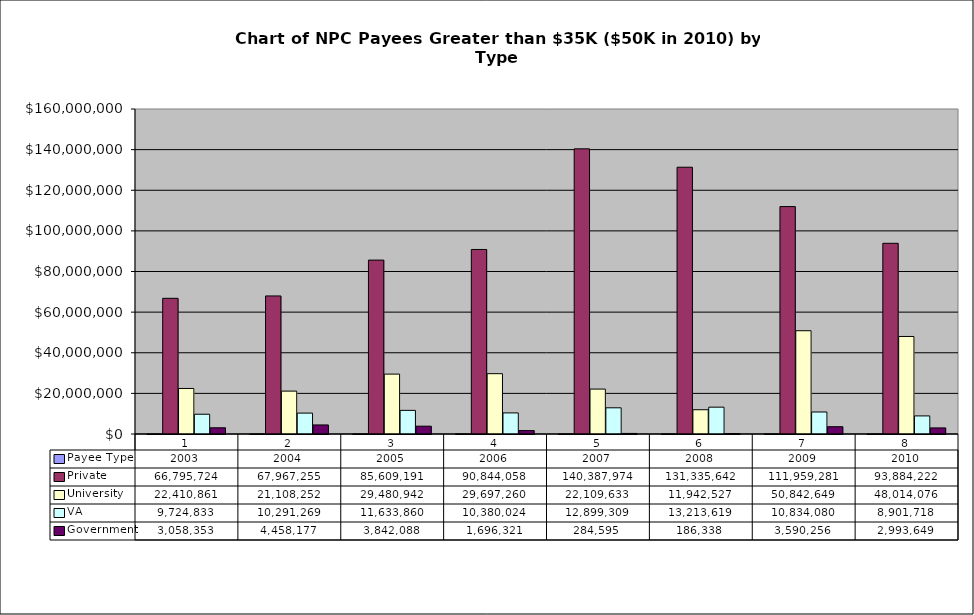
| Category | Payee Type | Private | University | VA | Government |
|---|---|---|---|---|---|
| 0 | 2003 | 66795724.18 | 22410860.58 | 9724832.94 | 3058352.9 |
| 1 | 2004 | 67967255 | 21108252 | 10291269 | 4458177 |
| 2 | 2005 | 85609191 | 29480942 | 11633860 | 3842088 |
| 3 | 2006 | 90844058 | 29697260 | 10380024 | 1696321 |
| 4 | 2007 | 140387974 | 22109633 | 12899309 | 284595 |
| 5 | 2008 | 131335642 | 11942527 | 13213619 | 186338 |
| 6 | 2009 | 111959281 | 50842649 | 10834080 | 3590256 |
| 7 | 2010 | 93884222 | 48014076 | 8901718 | 2993649 |